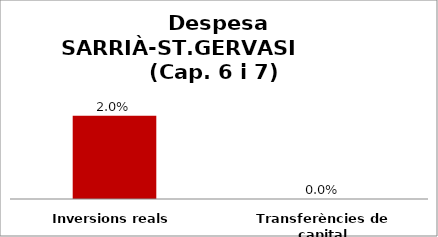
| Category | Series 0 |
|---|---|
| Inversions reals | 0.02 |
| Transferències de capital | 0 |